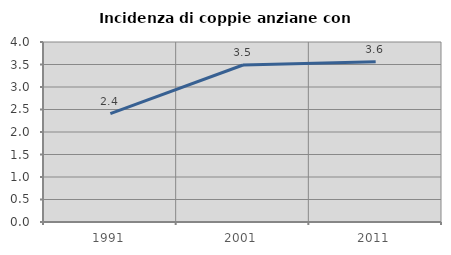
| Category | Incidenza di coppie anziane con figli |
|---|---|
| 1991.0 | 2.41 |
| 2001.0 | 3.489 |
| 2011.0 | 3.563 |